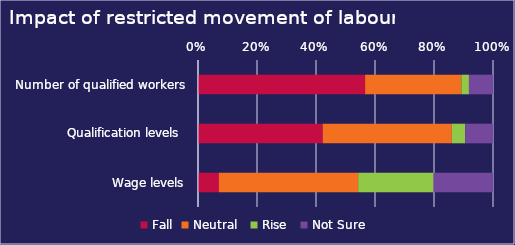
| Category | Fall | Neutral  | Rise  | Not Sure  |
|---|---|---|---|---|
|  Number of qualified workers | 0.567 | 0.326 | 0.026 | 0.082 |
|  Qualification levels  | 0.423 | 0.438 | 0.045 | 0.094 |
|  Wage levels | 0.071 | 0.472 | 0.255 | 0.202 |